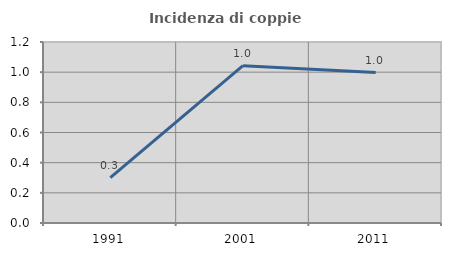
| Category | Incidenza di coppie miste |
|---|---|
| 1991.0 | 0.3 |
| 2001.0 | 1.043 |
| 2011.0 | 0.998 |